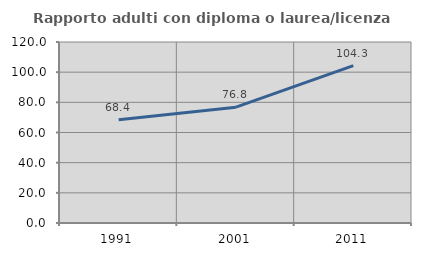
| Category | Rapporto adulti con diploma o laurea/licenza media  |
|---|---|
| 1991.0 | 68.421 |
| 2001.0 | 76.791 |
| 2011.0 | 104.324 |